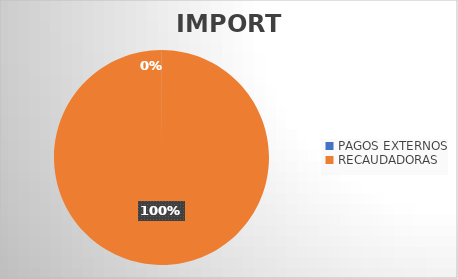
| Category | IMPORTE |
|---|---|
| PAGOS EXTERNOS | 454059.63 |
| RECAUDADORAS | 1414312591.01 |